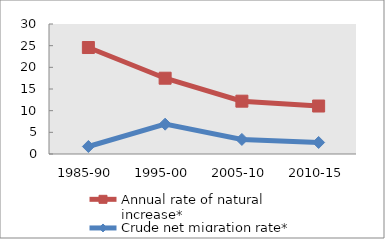
| Category | Annual rate of natural increase* | Crude net migration rate* |
|---|---|---|
| 1985-90 | 24.573 | 1.734 |
| 1995-00 | 17.488 | 6.886 |
| 2005-10 | 12.19 | 3.364 |
| 2010-15 | 11.072 | 2.658 |